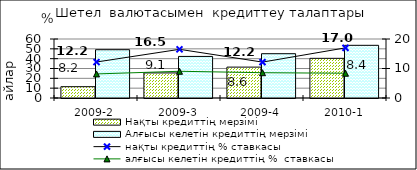
| Category | Нақты кредиттің мерзімі  | Алғысы келетін кредиттің мерзімі  |
|---|---|---|
| 2009-2 | 11.5 | 49.1 |
| 2009-3 | 25.5 | 42.28 |
| 2009-4 | 31.4 | 45.06 |
| 2010-1 | 40.33 | 53.58 |